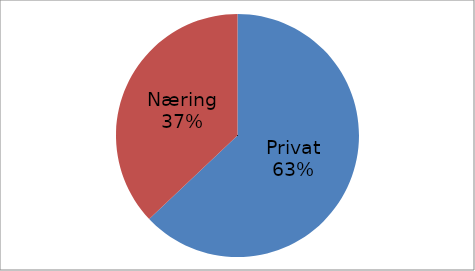
| Category | Series 0 |
|---|---|
| Privat | 44845008 |
| Næring | 26390738 |